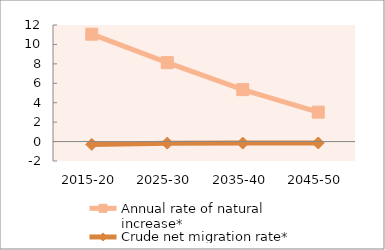
| Category | Annual rate of natural increase* | Crude net migration rate* |
|---|---|---|
| 2015-20 | 11.055 | -0.293 |
| 2025-30 | 8.124 | -0.161 |
| 2035-40 | 5.348 | -0.153 |
| 2045-50 | 3.028 | -0.147 |